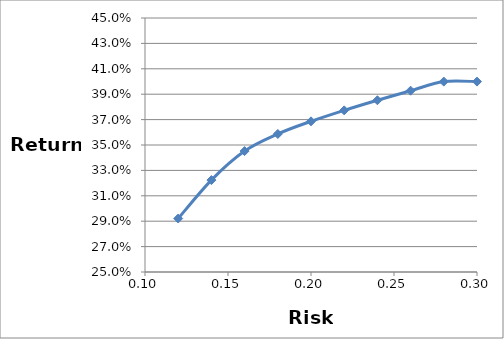
| Category | Return |
|---|---|
| 0.12 | 0.292 |
| 0.13999999999999999 | 0.322 |
| 0.16 | 0.345 |
| 0.18 | 0.359 |
| 0.19999999999999998 | 0.369 |
| 0.22 | 0.377 |
| 0.24 | 0.385 |
| 0.26 | 0.393 |
| 0.27999999999999997 | 0.4 |
| 0.3 | 0.4 |